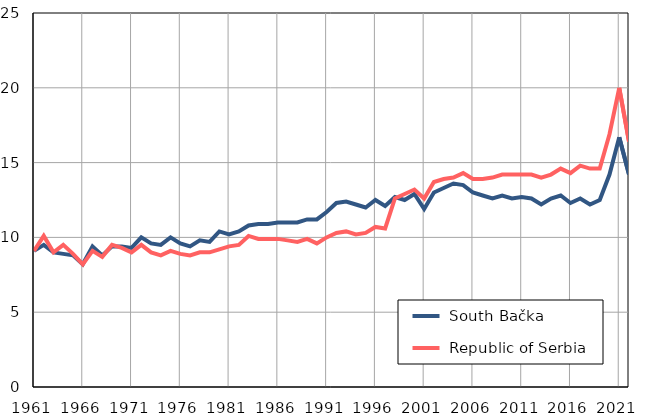
| Category |  South Bačka |  Republic of Serbia |
|---|---|---|
| 1961.0 | 9.1 | 9.1 |
| 1962.0 | 9.5 | 10.1 |
| 1963.0 | 9 | 9 |
| 1964.0 | 8.9 | 9.5 |
| 1965.0 | 8.8 | 8.9 |
| 1966.0 | 8.2 | 8.2 |
| 1967.0 | 9.4 | 9.1 |
| 1968.0 | 8.8 | 8.7 |
| 1969.0 | 9.4 | 9.5 |
| 1970.0 | 9.4 | 9.3 |
| 1971.0 | 9.3 | 9 |
| 1972.0 | 10 | 9.5 |
| 1973.0 | 9.6 | 9 |
| 1974.0 | 9.5 | 8.8 |
| 1975.0 | 10 | 9.1 |
| 1976.0 | 9.6 | 8.9 |
| 1977.0 | 9.4 | 8.8 |
| 1978.0 | 9.8 | 9 |
| 1979.0 | 9.7 | 9 |
| 1980.0 | 10.4 | 9.2 |
| 1981.0 | 10.2 | 9.4 |
| 1982.0 | 10.4 | 9.5 |
| 1983.0 | 10.8 | 10.1 |
| 1984.0 | 10.9 | 9.9 |
| 1985.0 | 10.9 | 9.9 |
| 1986.0 | 11 | 9.9 |
| 1987.0 | 11 | 9.8 |
| 1988.0 | 11 | 9.7 |
| 1989.0 | 11.2 | 9.9 |
| 1990.0 | 11.2 | 9.6 |
| 1991.0 | 11.7 | 10 |
| 1992.0 | 12.3 | 10.3 |
| 1993.0 | 12.4 | 10.4 |
| 1994.0 | 12.2 | 10.2 |
| 1995.0 | 12 | 10.3 |
| 1996.0 | 12.5 | 10.7 |
| 1997.0 | 12.1 | 10.6 |
| 1998.0 | 12.7 | 12.6 |
| 1999.0 | 12.5 | 12.9 |
| 2000.0 | 12.9 | 13.2 |
| 2001.0 | 11.9 | 12.6 |
| 2002.0 | 13 | 13.7 |
| 2003.0 | 13.3 | 13.9 |
| 2004.0 | 13.6 | 14 |
| 2005.0 | 13.5 | 14.3 |
| 2006.0 | 13 | 13.9 |
| 2007.0 | 12.8 | 13.9 |
| 2008.0 | 12.6 | 14 |
| 2009.0 | 12.8 | 14.2 |
| 2010.0 | 12.6 | 14.2 |
| 2011.0 | 12.7 | 14.2 |
| 2012.0 | 12.6 | 14.2 |
| 2013.0 | 12.2 | 14 |
| 2014.0 | 12.6 | 14.2 |
| 2015.0 | 12.8 | 14.6 |
| 2016.0 | 12.3 | 14.3 |
| 2017.0 | 12.6 | 14.8 |
| 2018.0 | 12.2 | 14.6 |
| 2019.0 | 12.5 | 14.6 |
| 2020.0 | 14.2 | 16.9 |
| 2021.0 | 16.7 | 20 |
| 2022.0 | 14.2 | 16.4 |